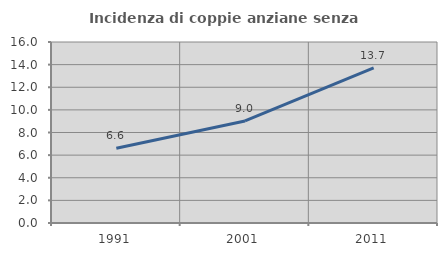
| Category | Incidenza di coppie anziane senza figli  |
|---|---|
| 1991.0 | 6.612 |
| 2001.0 | 9.018 |
| 2011.0 | 13.715 |